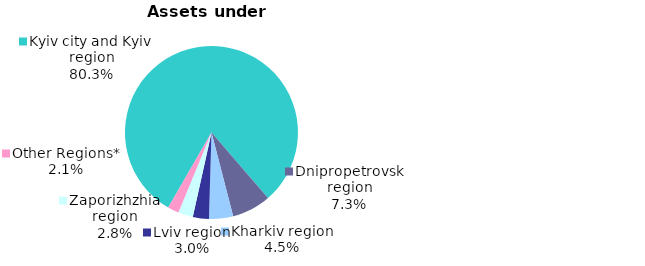
| Category | Series 0 |
|---|---|
| Kyiv city and Kyiv region | 0.803 |
| Dnipropetrovsk region | 0.073 |
| Kharkiv region | 0.045 |
| Lviv region | 0.03 |
| Zaporizhzhia region | 0.028 |
| Other Regions* | 0.021 |